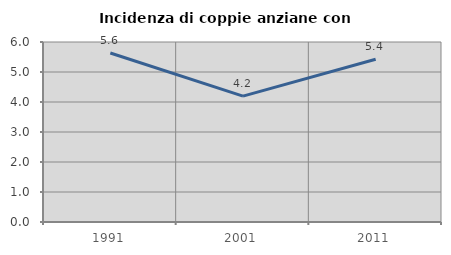
| Category | Incidenza di coppie anziane con figli |
|---|---|
| 1991.0 | 5.634 |
| 2001.0 | 4.196 |
| 2011.0 | 5.426 |